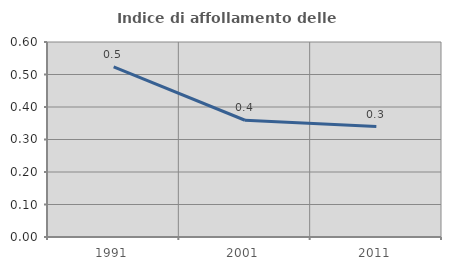
| Category | Indice di affollamento delle abitazioni  |
|---|---|
| 1991.0 | 0.524 |
| 2001.0 | 0.359 |
| 2011.0 | 0.34 |